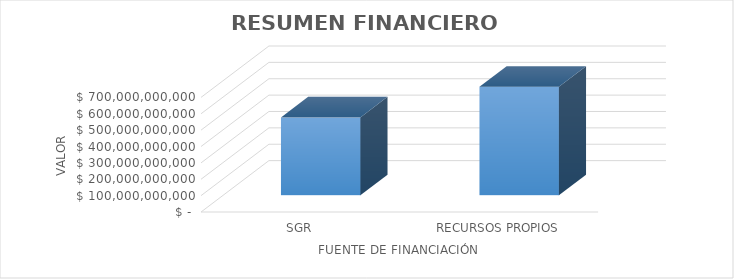
| Category | Series 0 |
|---|---|
| SGR | 475470137029.08 |
| RECURSOS PROPIOS | 662038747919.85 |